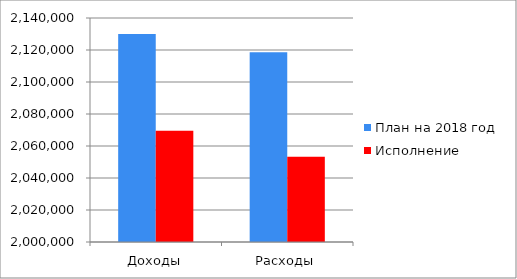
| Category | План на 2018 год | Исполнение |
|---|---|---|
| Доходы | 2130029 | 2069471.4 |
| Расходы | 2118558.3 | 2053236.9 |